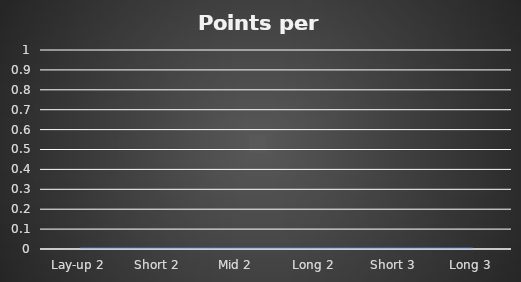
| Category | Series 0 |
|---|---|
| Lay-up 2 | 0 |
| Short 2 | 0 |
| Mid 2 | 0 |
| Long 2 | 0 |
| Short 3 | 0 |
| Long 3 | 0 |